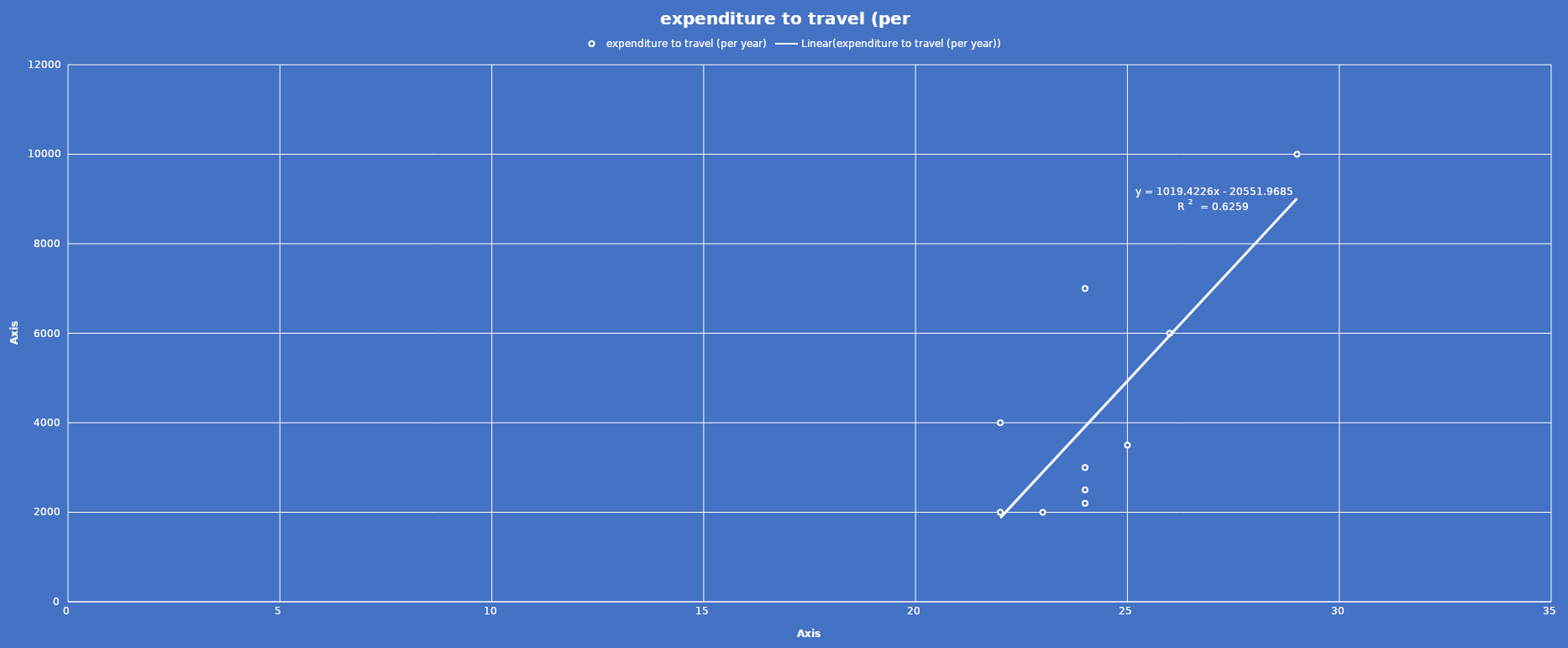
| Category | expenditure to travel (per year) |
|---|---|
| 23.0 | 2000 |
| 22.0 | 4000 |
| 24.0 | 3000 |
| 22.0 | 2000 |
| 29.0 | 10000 |
| 26.0 | 6000 |
| 24.0 | 7000 |
| 25.0 | 3500 |
| 24.0 | 2200 |
| 24.0 | 2500 |